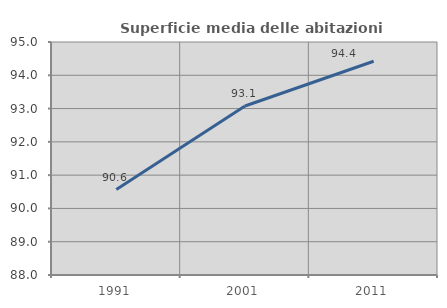
| Category | Superficie media delle abitazioni occupate |
|---|---|
| 1991.0 | 90.568 |
| 2001.0 | 93.078 |
| 2011.0 | 94.421 |